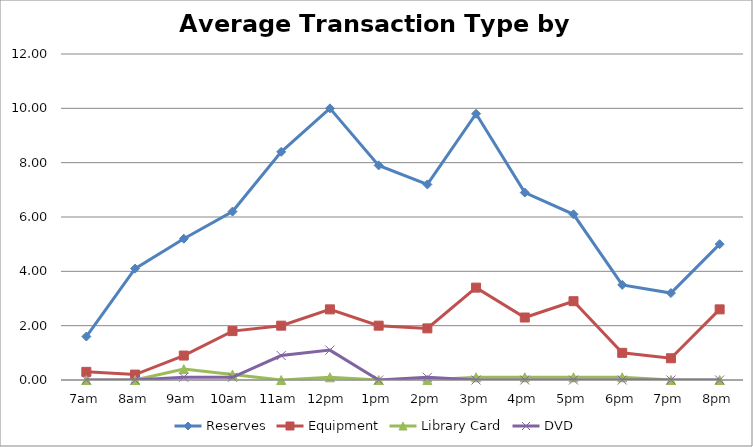
| Category | Reserves | Equipment | Library Card | DVD |
|---|---|---|---|---|
| 7am | 1.6 | 0.3 | 0 | 0 |
| 8am | 4.1 | 0.2 | 0 | 0 |
| 9am | 5.2 | 0.9 | 0.4 | 0.1 |
| 10am | 6.2 | 1.8 | 0.2 | 0.1 |
| 11am | 8.4 | 2 | 0 | 0.9 |
| 12pm | 10 | 2.6 | 0.1 | 1.1 |
| 1pm | 7.9 | 2 | 0 | 0 |
| 2pm | 7.2 | 1.9 | 0 | 0.1 |
| 3pm | 9.8 | 3.4 | 0.1 | 0 |
| 4pm | 6.9 | 2.3 | 0.1 | 0 |
| 5pm | 6.1 | 2.9 | 0.1 | 0 |
| 6pm | 3.5 | 1 | 0.1 | 0 |
| 7pm | 3.2 | 0.8 | 0 | 0 |
| 8pm | 5 | 2.6 | 0 | 0 |